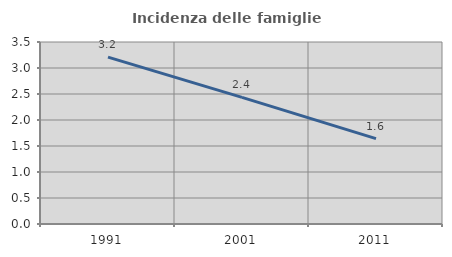
| Category | Incidenza delle famiglie numerose |
|---|---|
| 1991.0 | 3.209 |
| 2001.0 | 2.436 |
| 2011.0 | 1.641 |